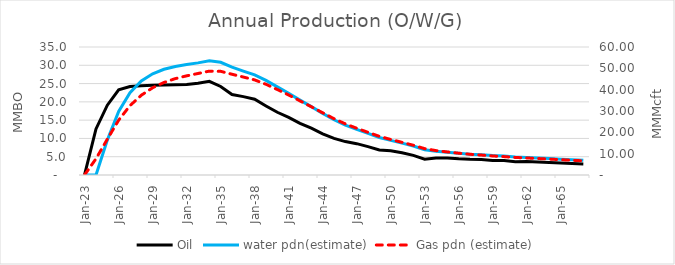
| Category | Oil | water pdn(estimate) |
|---|---|---|
| 2023-01-01 | 0.168 | 0 |
| 2024-01-01 | 12.584 | 0 |
| 2025-01-01 | 19.095 | 9.547 |
| 2026-01-01 | 23.265 | 17.361 |
| 2027-01-01 | 24.196 | 22.514 |
| 2028-01-01 | 24.409 | 25.713 |
| 2029-01-01 | 24.521 | 27.688 |
| 2030-01-01 | 24.581 | 28.903 |
| 2031-01-01 | 24.689 | 29.686 |
| 2032-01-01 | 24.771 | 30.197 |
| 2033-01-01 | 25.074 | 30.655 |
| 2034-01-01 | 25.63 | 31.208 |
| 2035-01-01 | 24.2 | 30.825 |
| 2036-01-01 | 22.002 | 29.496 |
| 2037-01-01 | 21.435 | 28.415 |
| 2038-01-01 | 20.706 | 27.402 |
| 2039-01-01 | 18.888 | 25.885 |
| 2040-01-01 | 17.149 | 24.106 |
| 2041-01-01 | 15.768 | 22.348 |
| 2042-01-01 | 14.137 | 20.477 |
| 2043-01-01 | 12.794 | 18.683 |
| 2044-01-01 | 11.262 | 16.841 |
| 2045-01-01 | 10.003 | 15.106 |
| 2046-01-01 | 9.138 | 13.633 |
| 2047-01-01 | 8.571 | 12.465 |
| 2048-01-01 | 7.771 | 11.364 |
| 2049-01-01 | 6.863 | 10.25 |
| 2050-01-01 | 6.628 | 9.464 |
| 2051-01-01 | 6.08 | 8.718 |
| 2052-01-01 | 5.364 | 7.913 |
| 2053-01-01 | 4.33 | 6.913 |
| 2054-01-01 | 4.656 | 6.476 |
| 2055-01-01 | 4.659 | 6.215 |
| 2056-01-01 | 4.425 | 5.942 |
| 2057-01-01 | 4.28 | 5.705 |
| 2058-01-01 | 4.241 | 5.543 |
| 2059-01-01 | 3.957 | 5.305 |
| 2060-01-01 | 3.96 | 5.163 |
| 2061-01-01 | 3.654 | 4.925 |
| 2062-01-01 | 3.712 | 4.811 |
| 2063-01-01 | 3.559 | 4.666 |
| 2064-01-01 | 3.412 | 4.505 |
| 2065-01-01 | 3.271 | 4.339 |
| 2066-01-01 | 3.136 | 4.171 |
| 2067-01-01 | 3.006 | 4.006 |